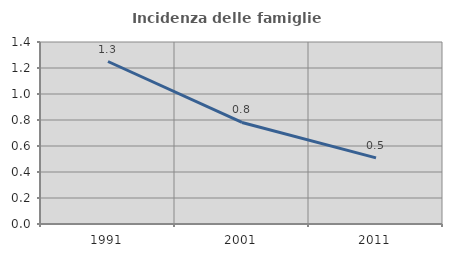
| Category | Incidenza delle famiglie numerose |
|---|---|
| 1991.0 | 1.25 |
| 2001.0 | 0.781 |
| 2011.0 | 0.508 |